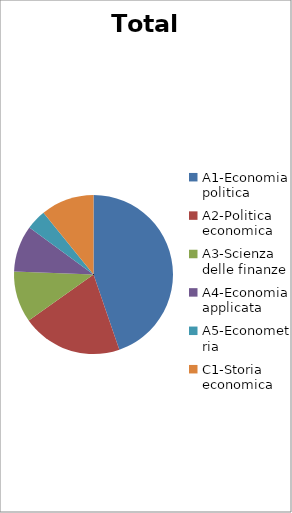
| Category | Totale | Series 1 |
|---|---|---|
| A1-Economia politica | 764 |  |
| A2-Politica economica | 349 |  |
| A3-Scienza delle finanze | 178 |  |
| A4-Economia applicata | 162 |  |
| A5-Econometria | 70 |  |
| C1-Storia economica | 185 |  |